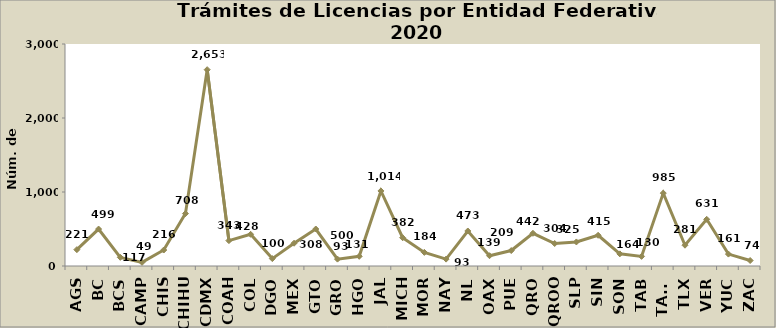
| Category | Series 0 |
|---|---|
| AGS | 221 |
| BC | 499 |
| BCS | 117 |
| CAMP | 49 |
| CHIS | 216 |
| CHIHU | 708 |
| CDMX | 2653 |
| COAH | 343 |
| COL | 428 |
| DGO | 100 |
| MEX | 308 |
| GTO | 500 |
| GRO | 93 |
| HGO | 131 |
| JAL | 1014 |
| MICH | 382 |
| MOR | 184 |
| NAY | 93 |
| NL | 473 |
| OAX | 139 |
| PUE | 209 |
| QRO | 442 |
| QROO | 304 |
| SLP | 325 |
| SIN | 415 |
| SON | 164 |
| TAB | 130 |
| TAMS | 985 |
| TLX | 281 |
| VER | 631 |
| YUC | 161 |
| ZAC | 74 |